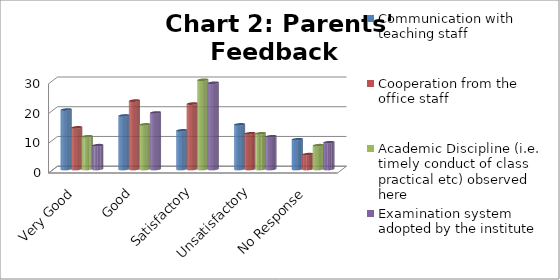
| Category | Communication with teaching staff | Cooperation from the office staff | Academic Discipline (i.e. timely conduct of class
practical etc) observed here | Examination system adopted by the institute |
|---|---|---|---|---|
| Very Good | 20 | 14 | 11 | 8 |
| Good | 18 | 23 | 15 | 19 |
| Satisfactory | 13 | 22 | 30 | 29 |
| Unsatisfactory | 15 | 12 | 12 | 11 |
| No Response | 10 | 5 | 8 | 9 |